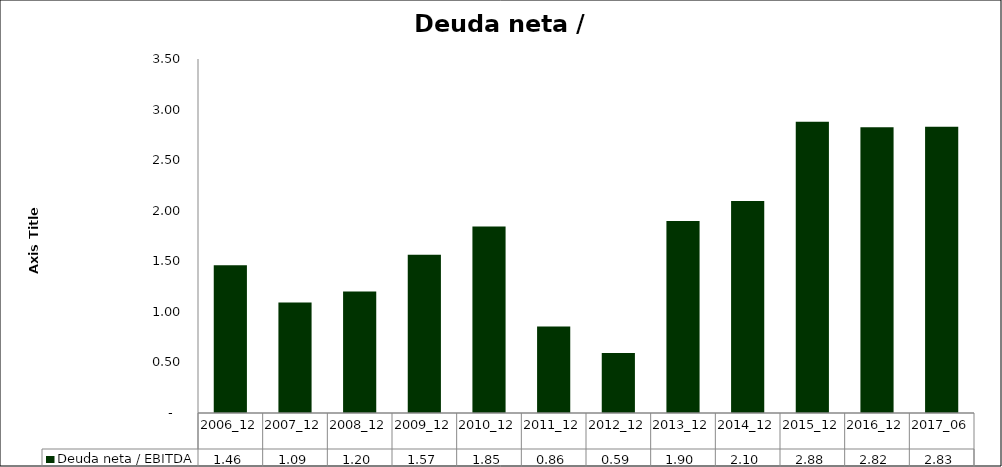
| Category | Deuda neta / EBITDA |
|---|---|
| 2006_12 | 1.461 |
| 2007_12 | 1.092 |
| 2008_12 | 1.202 |
| 2009_12 | 1.565 |
| 2010_12 | 1.845 |
| 2011_12 | 0.856 |
| 2012_12 | 0.594 |
| 2013_12 | 1.899 |
| 2014_12 | 2.097 |
| 2015_12 | 2.879 |
| 2016_12 | 2.824 |
| 2017_06 | 2.831 |